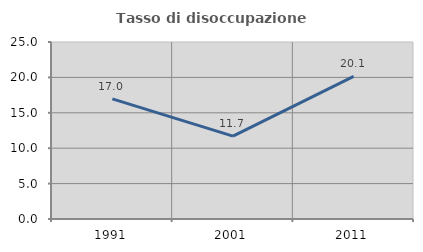
| Category | Tasso di disoccupazione giovanile  |
|---|---|
| 1991.0 | 16.962 |
| 2001.0 | 11.705 |
| 2011.0 | 20.132 |